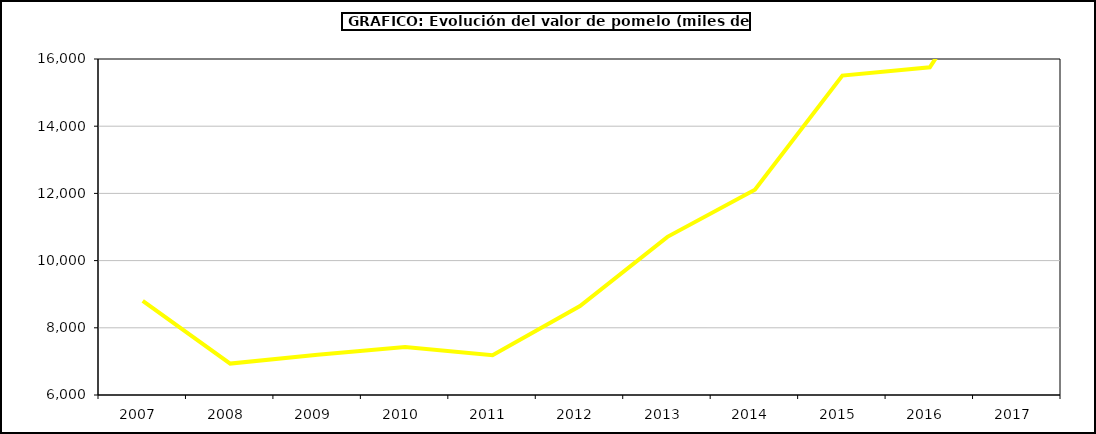
| Category | Valor |
|---|---|
| 2007.0 | 8799.68 |
| 2008.0 | 6934.237 |
| 2009.0 | 7196.478 |
| 2010.0 | 7430.969 |
| 2011.0 | 7186.419 |
| 2012.0 | 8649.711 |
| 2013.0 | 10707.894 |
| 2014.0 | 12111.902 |
| 2015.0 | 15505 |
| 2016.0 | 15755 |
| 2017.0 | 19680.125 |